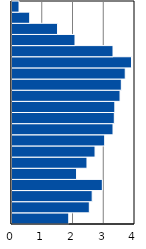
| Category | Series 0 |
|---|---|
| 0-4 | 1.846 |
| 5-9 | 2.514 |
| 10-14 | 2.608 |
| 15-19 | 2.938 |
| 20-24 | 2.1 |
| 25-29 | 2.438 |
| 30-34 | 2.701 |
| 35-39 | 3.014 |
| 40-44 | 3.285 |
| 45-49 | 3.327 |
| 50-54 | 3.344 |
| 55-59 | 3.513 |
| 60-64 | 3.556 |
| 65-69 | 3.683 |
| 70-74 | 3.886 |
| 75-79 | 3.285 |
| 80-84 | 2.049 |
| 85-89 | 1.482 |
| 90-94 | 0.576 |
| 95+ | 0.229 |